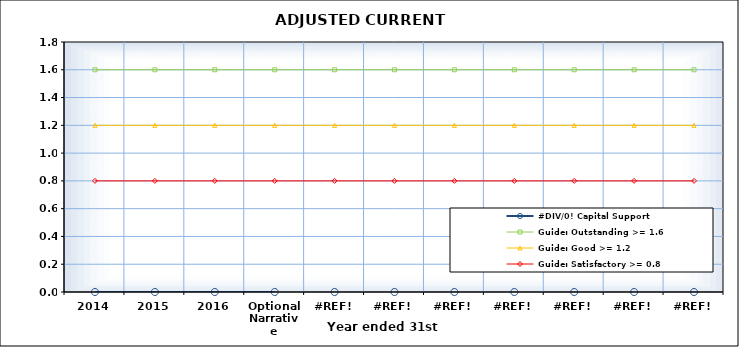
| Category | #DIV/0! Capital Support | Guide: Outstanding >= 1.6 | Guide: Good >= 1.2 | Guide: Satisfactory >= 0.8 |
|---|---|---|---|---|
| 2014 |  | 1.6 | 1.2 | 0.8 |
| 2015 |  | 1.6 | 1.2 | 0.8 |
| 2016 |  | 1.6 | 1.2 | 0.8 |
| Optional Narrative |  | 1.6 | 1.2 | 0.8 |
| #REF! |  | 1.6 | 1.2 | 0.8 |
| #REF! |  | 1.6 | 1.2 | 0.8 |
| #REF! |  | 1.6 | 1.2 | 0.8 |
| #REF! |  | 1.6 | 1.2 | 0.8 |
| #REF! |  | 1.6 | 1.2 | 0.8 |
| #REF! |  | 1.6 | 1.2 | 0.8 |
| #REF! |  | 1.6 | 1.2 | 0.8 |